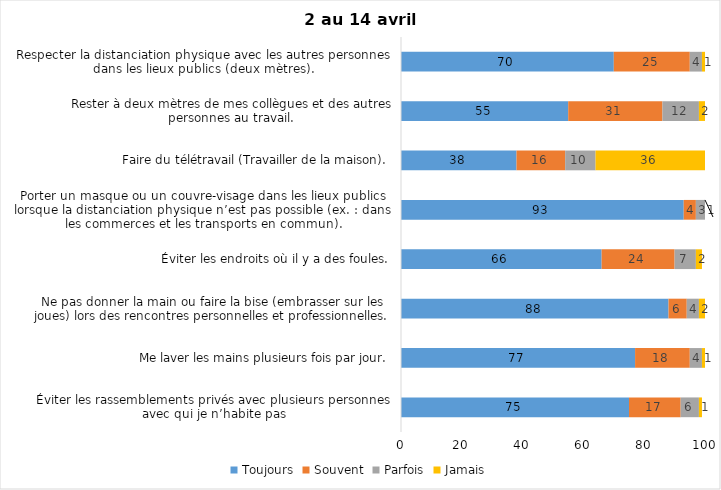
| Category | Toujours | Souvent | Parfois | Jamais |
|---|---|---|---|---|
| Éviter les rassemblements privés avec plusieurs personnes avec qui je n’habite pas | 75 | 17 | 6 | 1 |
| Me laver les mains plusieurs fois par jour. | 77 | 18 | 4 | 1 |
| Ne pas donner la main ou faire la bise (embrasser sur les joues) lors des rencontres personnelles et professionnelles. | 88 | 6 | 4 | 2 |
| Éviter les endroits où il y a des foules. | 66 | 24 | 7 | 2 |
| Porter un masque ou un couvre-visage dans les lieux publics lorsque la distanciation physique n’est pas possible (ex. : dans les commerces et les transports en commun). | 93 | 4 | 3 | 1 |
| Faire du télétravail (Travailler de la maison). | 38 | 16 | 10 | 36 |
| Rester à deux mètres de mes collègues et des autres personnes au travail. | 55 | 31 | 12 | 2 |
| Respecter la distanciation physique avec les autres personnes dans les lieux publics (deux mètres). | 70 | 25 | 4 | 1 |